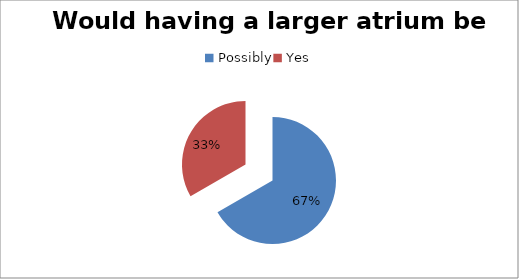
| Category | Series 0 |
|---|---|
| Possibly | 6 |
| Yes | 3 |